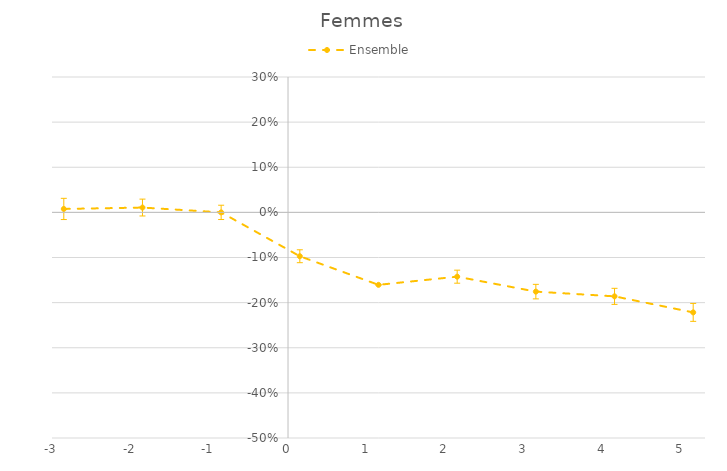
| Category | Ensemble |
|---|---|
| -2.8500000000000005 | 0.008 |
| -1.8499999999999999 | 0.011 |
| -0.8499999999999999 | 0 |
| 0.15000000000000002 | -0.097 |
| 1.1500000000000001 | -0.161 |
| 2.1499999999999995 | -0.142 |
| 3.1499999999999995 | -0.176 |
| 4.1499999999999995 | -0.186 |
| 5.1499999999999995 | -0.222 |